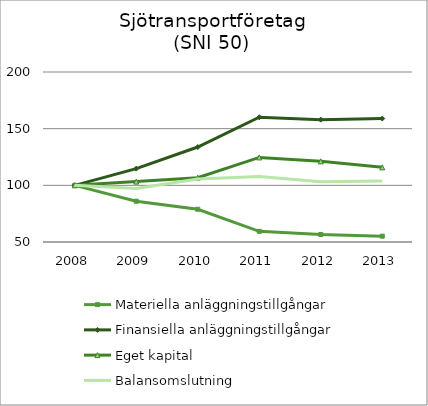
| Category | Materiella anläggningstillgångar | Finansiella anläggningstillgångar | Eget kapital | Balansomslutning |
|---|---|---|---|---|
| 2008.0 | 100 | 100 | 100 | 100 |
| 2009.0 | 85.988 | 114.764 | 103.29 | 97.151 |
| 2010.0 | 78.893 | 133.808 | 106.754 | 105.562 |
| 2011.0 | 59.407 | 160.066 | 124.607 | 107.781 |
| 2012.0 | 56.657 | 157.956 | 121.158 | 103.069 |
| 2013.0 | 55.136 | 158.95 | 115.869 | 103.811 |